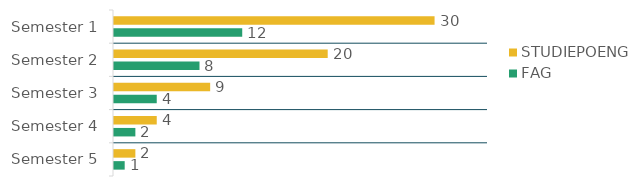
| Category | STUDIEPOENG  | FAG  |
|---|---|---|
| Semester 1 | 30 | 12 |
| Semester 2 | 20 | 8 |
| Semester 3 | 9 | 4 |
| Semester 4 | 4 | 2 |
| Semester 5 | 2 | 1 |